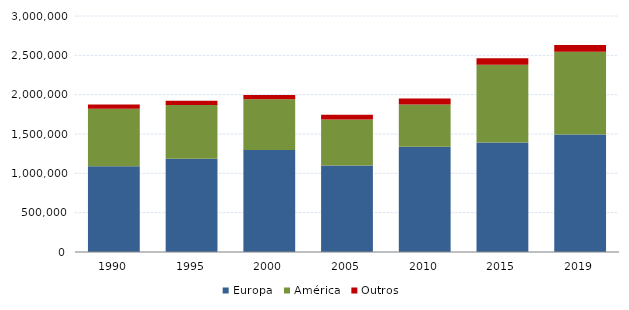
| Category | Europa | América | Outros |
|---|---|---|---|
| 1990.0 | 1089715 | 730429 | 53313 |
| 1995.0 | 1184057 | 685649 | 52614 |
| 2000.0 | 1297016 | 644901 | 53469 |
| 2005.0 | 1100491 | 583816 | 60434 |
| 2010.0 | 1336976 | 537339 | 76077 |
| 2015.0 | 1391068 | 990048 | 80354 |
| 2019.0 | 1493128 | 1051484 | 86947 |